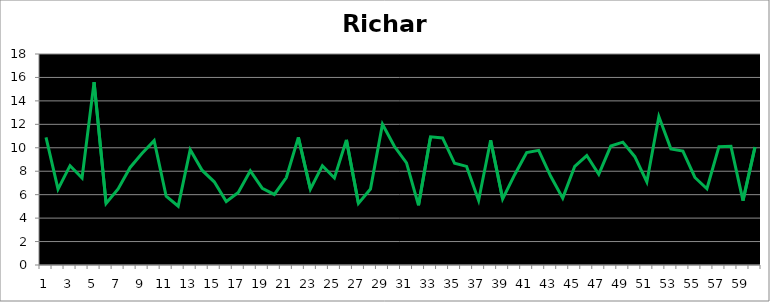
| Category | Richard |
|---|---|
| 0 | 10.888 |
| 1 | 6.469 |
| 2 | 8.474 |
| 3 | 7.427 |
| 4 | 15.598 |
| 5 | 5.253 |
| 6 | 6.486 |
| 7 | 8.319 |
| 8 | 9.53 |
| 9 | 10.608 |
| 10 | 5.869 |
| 11 | 5.018 |
| 12 | 9.84 |
| 13 | 8.066 |
| 14 | 7.099 |
| 15 | 5.417 |
| 16 | 6.193 |
| 17 | 8.037 |
| 18 | 6.54 |
| 19 | 6.018 |
| 20 | 7.462 |
| 21 | 10.888 |
| 22 | 6.469 |
| 23 | 8.474 |
| 24 | 7.427 |
| 25 | 10.676 |
| 26 | 5.253 |
| 27 | 6.486 |
| 28 | 12.006 |
| 29 | 10.105 |
| 30 | 8.718 |
| 31 | 5.09 |
| 32 | 10.935 |
| 33 | 10.843 |
| 34 | 8.674 |
| 35 | 8.41 |
| 36 | 5.507 |
| 37 | 10.637 |
| 38 | 5.641 |
| 39 | 7.706 |
| 40 | 9.586 |
| 41 | 9.777 |
| 42 | 7.569 |
| 43 | 5.705 |
| 44 | 8.417 |
| 45 | 9.337 |
| 46 | 7.733 |
| 47 | 10.147 |
| 48 | 10.479 |
| 49 | 9.241 |
| 50 | 7.08 |
| 51 | 12.66 |
| 52 | 9.905 |
| 53 | 9.719 |
| 54 | 7.466 |
| 55 | 6.505 |
| 56 | 10.093 |
| 57 | 10.122 |
| 58 | 5.49 |
| 59 | 10.057 |